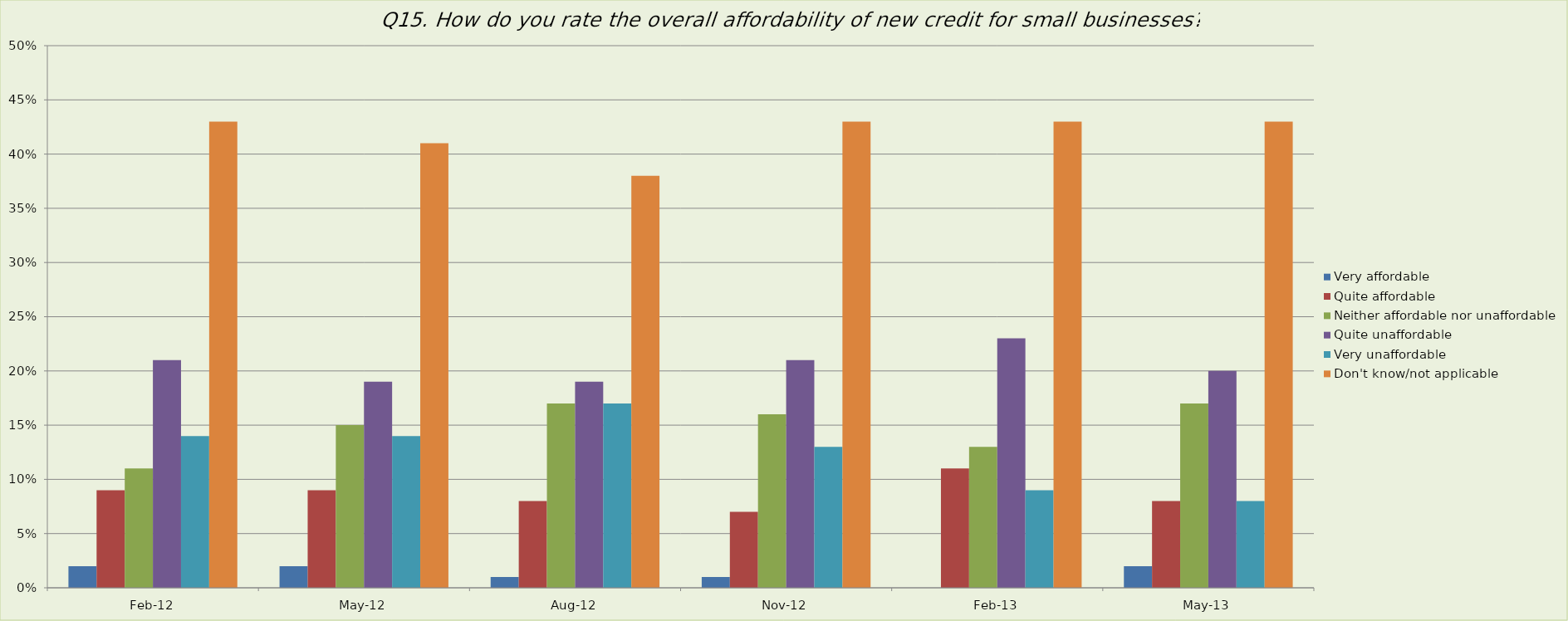
| Category | Very affordable | Quite affordable | Neither affordable nor unaffordable | Quite unaffordable | Very unaffordable | Don't know/not applicable |
|---|---|---|---|---|---|---|
| 2012-02-01 | 0.02 | 0.09 | 0.11 | 0.21 | 0.14 | 0.43 |
| 2012-05-01 | 0.02 | 0.09 | 0.15 | 0.19 | 0.14 | 0.41 |
| 2012-08-01 | 0.01 | 0.08 | 0.17 | 0.19 | 0.17 | 0.38 |
| 2012-11-01 | 0.01 | 0.07 | 0.16 | 0.21 | 0.13 | 0.43 |
| 2013-02-01 | 0 | 0.11 | 0.13 | 0.23 | 0.09 | 0.43 |
| 2013-05-01 | 0.02 | 0.08 | 0.17 | 0.2 | 0.08 | 0.43 |